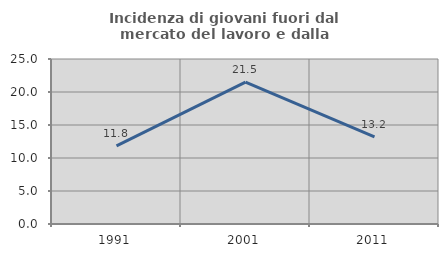
| Category | Incidenza di giovani fuori dal mercato del lavoro e dalla formazione  |
|---|---|
| 1991.0 | 11.842 |
| 2001.0 | 21.505 |
| 2011.0 | 13.198 |